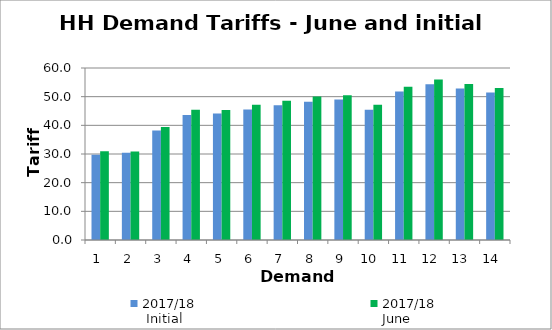
| Category | 2017/18
 Initial
 (£/kW) | 2017/18
June
(£/kW) |
|---|---|---|
| 1.0 | 29.732 | 30.954 |
| 2.0 | 30.446 | 30.88 |
| 3.0 | 38.161 | 39.402 |
| 4.0 | 43.593 | 45.472 |
| 5.0 | 44.126 | 45.33 |
| 6.0 | 45.498 | 47.199 |
| 7.0 | 47.007 | 48.575 |
| 8.0 | 48.259 | 50.037 |
| 9.0 | 49.023 | 50.503 |
| 10.0 | 45.437 | 47.166 |
| 11.0 | 51.83 | 53.475 |
| 12.0 | 54.371 | 55.953 |
| 13.0 | 52.832 | 54.454 |
| 14.0 | 51.429 | 53.047 |